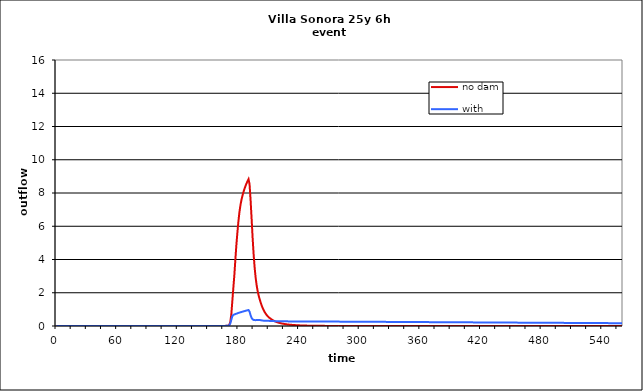
| Category | no dam | with dam |
|---|---|---|
| 0.0 | 0 | 0 |
| 1.0 | 0 | 0 |
| 2.0 | 0 | 0 |
| 3.0 | 0 | 0 |
| 4.0 | 0 | 0 |
| 5.0 | 0 | 0 |
| 6.0 | 0 | 0 |
| 7.0 | 0 | 0 |
| 8.0 | 0 | 0 |
| 9.0 | 0 | 0 |
| 10.0 | 0 | 0 |
| 11.0 | 0 | 0 |
| 12.0 | 0 | 0 |
| 13.0 | 0 | 0 |
| 14.0 | 0 | 0 |
| 15.0 | 0 | 0 |
| 16.0 | 0 | 0 |
| 17.0 | 0 | 0 |
| 18.0 | 0 | 0 |
| 19.0 | 0 | 0 |
| 20.0 | 0 | 0 |
| 21.0 | 0 | 0 |
| 22.0 | 0 | 0 |
| 23.0 | 0 | 0 |
| 24.0 | 0 | 0 |
| 25.0 | 0 | 0 |
| 26.0 | 0 | 0 |
| 27.0 | 0 | 0 |
| 28.0 | 0 | 0 |
| 29.0 | 0 | 0 |
| 30.0 | 0 | 0 |
| 31.0 | 0 | 0 |
| 32.0 | 0 | 0 |
| 33.0 | 0 | 0 |
| 34.0 | 0 | 0 |
| 35.0 | 0 | 0 |
| 36.0 | 0 | 0 |
| 37.0 | 0 | 0 |
| 38.0 | 0 | 0 |
| 39.0 | 0 | 0 |
| 40.0 | 0 | 0 |
| 41.0 | 0 | 0 |
| 42.0 | 0 | 0 |
| 43.0 | 0 | 0 |
| 44.0 | 0 | 0 |
| 45.0 | 0 | 0 |
| 46.0 | 0 | 0 |
| 47.0 | 0 | 0 |
| 48.0 | 0 | 0 |
| 49.0 | 0 | 0 |
| 50.0 | 0 | 0 |
| 51.0 | 0 | 0 |
| 52.0 | 0 | 0 |
| 53.0 | 0 | 0 |
| 54.0 | 0 | 0 |
| 55.0 | 0 | 0 |
| 56.0 | 0 | 0 |
| 57.0 | 0 | 0 |
| 58.0 | 0 | 0 |
| 59.0 | 0 | 0 |
| 60.0 | 0 | 0 |
| 61.0 | 0 | 0 |
| 62.0 | 0 | 0 |
| 63.0 | 0 | 0 |
| 64.0 | 0 | 0 |
| 65.0 | 0 | 0 |
| 66.0 | 0 | 0 |
| 67.0 | 0 | 0 |
| 68.0 | 0 | 0 |
| 69.0 | 0 | 0 |
| 70.0 | 0 | 0 |
| 71.0 | 0 | 0 |
| 72.0 | 0 | 0 |
| 73.0 | 0 | 0 |
| 74.0 | 0 | 0 |
| 75.0 | 0 | 0 |
| 76.0 | 0 | 0 |
| 77.0 | 0 | 0 |
| 78.0 | 0 | 0 |
| 79.0 | 0 | 0 |
| 80.0 | 0 | 0 |
| 81.0 | 0 | 0 |
| 82.0 | 0 | 0 |
| 83.0 | 0 | 0 |
| 84.0 | 0 | 0 |
| 85.0 | 0 | 0 |
| 86.0 | 0 | 0 |
| 87.0 | 0 | 0 |
| 88.0 | 0 | 0 |
| 89.0 | 0 | 0 |
| 90.0 | 0 | 0 |
| 91.0 | 0 | 0 |
| 92.0 | 0 | 0 |
| 93.0 | 0 | 0 |
| 94.0 | 0 | 0 |
| 95.0 | 0 | 0 |
| 96.0 | 0 | 0 |
| 97.0 | 0 | 0 |
| 98.0 | 0 | 0 |
| 99.0 | 0 | 0 |
| 100.0 | 0 | 0 |
| 101.0 | 0 | 0 |
| 102.0 | 0 | 0 |
| 103.0 | 0 | 0 |
| 104.0 | 0 | 0 |
| 105.0 | 0 | 0 |
| 106.0 | 0 | 0 |
| 107.0 | 0 | 0 |
| 108.0 | 0 | 0 |
| 109.0 | 0 | 0 |
| 110.0 | 0 | 0 |
| 111.0 | 0 | 0 |
| 112.0 | 0 | 0 |
| 113.0 | 0 | 0 |
| 114.0 | 0 | 0 |
| 115.0 | 0 | 0 |
| 116.0 | 0 | 0 |
| 117.0 | 0 | 0 |
| 118.0 | 0 | 0 |
| 119.0 | 0 | 0 |
| 120.0 | 0 | 0 |
| 121.0 | 0 | 0 |
| 122.0 | 0 | 0 |
| 123.0 | 0 | 0 |
| 124.0 | 0 | 0 |
| 125.0 | 0 | 0 |
| 126.0 | 0 | 0 |
| 127.0 | 0 | 0 |
| 128.0 | 0 | 0 |
| 129.0 | 0 | 0 |
| 130.0 | 0 | 0 |
| 131.0 | 0 | 0 |
| 132.0 | 0 | 0 |
| 133.0 | 0 | 0 |
| 134.0 | 0 | 0 |
| 135.0 | 0 | 0 |
| 136.0 | 0 | 0 |
| 137.0 | 0 | 0 |
| 138.0 | 0 | 0 |
| 139.0 | 0 | 0 |
| 140.0 | 0 | 0 |
| 141.0 | 0 | 0 |
| 142.0 | 0 | 0 |
| 143.0 | 0 | 0 |
| 144.0 | 0 | 0 |
| 145.0 | 0 | 0 |
| 146.0 | 0 | 0 |
| 147.0 | 0 | 0 |
| 148.0 | 0 | 0 |
| 149.0 | 0 | 0 |
| 150.0 | 0 | 0 |
| 151.0 | 0 | 0 |
| 152.0 | 0 | 0 |
| 153.0 | 0 | 0 |
| 154.0 | 0 | 0 |
| 155.0 | 0 | 0 |
| 156.0 | 0 | 0 |
| 157.0 | 0 | 0 |
| 158.0 | 0 | 0 |
| 159.0 | 0 | 0 |
| 160.0 | 0 | 0 |
| 161.0 | 0 | 0 |
| 162.0 | 0 | 0 |
| 163.0 | 0 | 0 |
| 164.0 | 0.001 | 0.001 |
| 165.0 | 0.002 | 0.002 |
| 166.0 | 0.003 | 0.004 |
| 167.0 | 0.007 | 0.007 |
| 168.0 | 0.011 | 0.011 |
| 169.0 | 0.016 | 0.016 |
| 170.0 | 0.021 | 0.021 |
| 171.0 | 0.078 | 0.05 |
| 172.0 | 0.256 | 0.164 |
| 173.0 | 0.726 | 0.386 |
| 174.0 | 1.527 | 0.597 |
| 175.0 | 2.314 | 0.669 |
| 176.0 | 3.094 | 0.697 |
| 177.0 | 4.027 | 0.718 |
| 178.0 | 4.903 | 0.739 |
| 179.0 | 5.638 | 0.763 |
| 180.0 | 6.303 | 0.786 |
| 181.0 | 6.851 | 0.806 |
| 182.0 | 7.267 | 0.825 |
| 183.0 | 7.584 | 0.843 |
| 184.0 | 7.842 | 0.861 |
| 185.0 | 8.06 | 0.879 |
| 186.0 | 8.254 | 0.897 |
| 187.0 | 8.424 | 0.914 |
| 188.0 | 8.575 | 0.931 |
| 189.0 | 8.709 | 0.946 |
| 190.0 | 8.83 | 0.961 |
| 191.0 | 8.529 | 0.863 |
| 192.0 | 7.603 | 0.653 |
| 193.0 | 6.498 | 0.49 |
| 194.0 | 5.346 | 0.405 |
| 195.0 | 4.343 | 0.367 |
| 196.0 | 3.541 | 0.354 |
| 197.0 | 2.923 | 0.353 |
| 198.0 | 2.457 | 0.356 |
| 199.0 | 2.105 | 0.359 |
| 200.0 | 1.834 | 0.362 |
| 201.0 | 1.613 | 0.361 |
| 202.0 | 1.414 | 0.351 |
| 203.0 | 1.236 | 0.338 |
| 204.0 | 1.082 | 0.327 |
| 205.0 | 0.951 | 0.32 |
| 206.0 | 0.837 | 0.314 |
| 207.0 | 0.739 | 0.311 |
| 208.0 | 0.655 | 0.309 |
| 209.0 | 0.584 | 0.308 |
| 210.0 | 0.525 | 0.309 |
| 211.0 | 0.475 | 0.308 |
| 212.0 | 0.43 | 0.305 |
| 213.0 | 0.389 | 0.3 |
| 214.0 | 0.35 | 0.297 |
| 215.0 | 0.316 | 0.294 |
| 216.0 | 0.286 | 0.291 |
| 217.0 | 0.259 | 0.289 |
| 218.0 | 0.235 | 0.288 |
| 219.0 | 0.214 | 0.286 |
| 220.0 | 0.195 | 0.286 |
| 221.0 | 0.178 | 0.285 |
| 222.0 | 0.164 | 0.283 |
| 223.0 | 0.15 | 0.282 |
| 224.0 | 0.138 | 0.281 |
| 225.0 | 0.127 | 0.28 |
| 226.0 | 0.116 | 0.28 |
| 227.0 | 0.107 | 0.279 |
| 228.0 | 0.099 | 0.279 |
| 229.0 | 0.091 | 0.278 |
| 230.0 | 0.084 | 0.278 |
| 231.0 | 0.078 | 0.278 |
| 232.0 | 0.072 | 0.277 |
| 233.0 | 0.067 | 0.277 |
| 234.0 | 0.062 | 0.277 |
| 235.0 | 0.058 | 0.276 |
| 236.0 | 0.054 | 0.276 |
| 237.0 | 0.05 | 0.276 |
| 238.0 | 0.046 | 0.276 |
| 239.0 | 0.043 | 0.275 |
| 240.0 | 0.04 | 0.275 |
| 241.0 | 0.037 | 0.275 |
| 242.0 | 0.034 | 0.275 |
| 243.0 | 0.031 | 0.274 |
| 244.0 | 0.029 | 0.274 |
| 245.0 | 0.027 | 0.274 |
| 246.0 | 0.025 | 0.274 |
| 247.0 | 0.024 | 0.273 |
| 248.0 | 0.022 | 0.273 |
| 249.0 | 0.021 | 0.273 |
| 250.0 | 0.019 | 0.272 |
| 251.0 | 0.018 | 0.272 |
| 252.0 | 0.017 | 0.272 |
| 253.0 | 0.016 | 0.272 |
| 254.0 | 0.015 | 0.271 |
| 255.0 | 0.014 | 0.271 |
| 256.0 | 0.013 | 0.271 |
| 257.0 | 0.012 | 0.27 |
| 258.0 | 0.011 | 0.27 |
| 259.0 | 0.011 | 0.27 |
| 260.0 | 0.01 | 0.269 |
| 261.0 | 0.01 | 0.269 |
| 262.0 | 0.009 | 0.269 |
| 263.0 | 0.009 | 0.269 |
| 264.0 | 0.008 | 0.268 |
| 265.0 | 0.008 | 0.268 |
| 266.0 | 0.007 | 0.268 |
| 267.0 | 0.007 | 0.267 |
| 268.0 | 0.006 | 0.267 |
| 269.0 | 0.006 | 0.267 |
| 270.0 | 0.006 | 0.266 |
| 271.0 | 0.005 | 0.266 |
| 272.0 | 0.005 | 0.266 |
| 273.0 | 0.005 | 0.265 |
| 274.0 | 0.004 | 0.265 |
| 275.0 | 0.004 | 0.265 |
| 276.0 | 0.004 | 0.264 |
| 277.0 | 0.003 | 0.264 |
| 278.0 | 0.003 | 0.264 |
| 279.0 | 0.003 | 0.263 |
| 280.0 | 0.003 | 0.263 |
| 281.0 | 0.002 | 0.263 |
| 282.0 | 0.002 | 0.263 |
| 283.0 | 0.002 | 0.262 |
| 284.0 | 0.002 | 0.262 |
| 285.0 | 0.002 | 0.262 |
| 286.0 | 0.001 | 0.261 |
| 287.0 | 0.001 | 0.261 |
| 288.0 | 0.001 | 0.261 |
| 289.0 | 0.001 | 0.26 |
| 290.0 | 0.001 | 0.26 |
| 291.0 | 0.001 | 0.26 |
| 292.0 | 0.001 | 0.259 |
| 293.0 | 0.001 | 0.259 |
| 294.0 | 0.001 | 0.259 |
| 295.0 | 0.001 | 0.258 |
| 296.0 | 0 | 0.258 |
| 297.0 | 0 | 0.258 |
| 298.0 | 0 | 0.257 |
| 299.0 | 0 | 0.257 |
| 300.0 | 0 | 0.257 |
| 301.0 | 0 | 0.256 |
| 302.0 | 0 | 0.256 |
| 303.0 | 0 | 0.256 |
| 304.0 | 0 | 0.255 |
| 305.0 | 0 | 0.255 |
| 306.0 | 0 | 0.255 |
| 307.0 | 0 | 0.254 |
| 308.0 | 0 | 0.254 |
| 309.0 | 0 | 0.254 |
| 310.0 | 0 | 0.253 |
| 311.0 | 0 | 0.253 |
| 312.0 | 0 | 0.253 |
| 313.0 | 0 | 0.252 |
| 314.0 | 0 | 0.252 |
| 315.0 | 0 | 0.252 |
| 316.0 | 0 | 0.251 |
| 317.0 | 0 | 0.251 |
| 318.0 | 0 | 0.251 |
| 319.0 | 0 | 0.25 |
| 320.0 | 0 | 0.25 |
| 321.0 | 0 | 0.25 |
| 322.0 | 0 | 0.249 |
| 323.0 | 0 | 0.249 |
| 324.0 | 0 | 0.249 |
| 325.0 | 0 | 0.248 |
| 326.0 | 0 | 0.248 |
| 327.0 | 0 | 0.248 |
| 328.0 | 0 | 0.247 |
| 329.0 | 0 | 0.247 |
| 330.0 | 0 | 0.247 |
| 331.0 | 0 | 0.246 |
| 332.0 | 0 | 0.246 |
| 333.0 | 0 | 0.245 |
| 334.0 | 0 | 0.245 |
| 335.0 | 0 | 0.245 |
| 336.0 | 0 | 0.244 |
| 337.0 | 0 | 0.244 |
| 338.0 | 0 | 0.244 |
| 339.0 | 0 | 0.243 |
| 340.0 | 0 | 0.243 |
| 341.0 | 0 | 0.243 |
| 342.0 | 0 | 0.242 |
| 343.0 | 0 | 0.242 |
| 344.0 | 0 | 0.242 |
| 345.0 | 0 | 0.241 |
| 346.0 | 0 | 0.241 |
| 347.0 | 0 | 0.241 |
| 348.0 | 0 | 0.24 |
| 349.0 | 0 | 0.24 |
| 350.0 | 0 | 0.239 |
| 351.0 | 0 | 0.239 |
| 352.0 | 0 | 0.239 |
| 353.0 | 0 | 0.238 |
| 354.0 | 0 | 0.238 |
| 355.0 | 0 | 0.238 |
| 356.0 | 0 | 0.237 |
| 357.0 | 0 | 0.237 |
| 358.0 | 0 | 0.237 |
| 359.0 | 0 | 0.236 |
| 360.0 | 0 | 0.236 |
| 361.0 | 0 | 0.236 |
| 362.0 | 0 | 0.235 |
| 363.0 | 0 | 0.235 |
| 364.0 | 0 | 0.235 |
| 365.0 | 0 | 0.234 |
| 366.0 | 0 | 0.234 |
| 367.0 | 0 | 0.233 |
| 368.0 | 0 | 0.233 |
| 369.0 | 0 | 0.233 |
| 370.0 | 0 | 0.232 |
| 371.0 | 0 | 0.232 |
| 372.0 | 0 | 0.232 |
| 373.0 | 0 | 0.231 |
| 374.0 | 0 | 0.231 |
| 375.0 | 0 | 0.231 |
| 376.0 | 0 | 0.23 |
| 377.0 | 0 | 0.23 |
| 378.0 | 0 | 0.23 |
| 379.0 | 0 | 0.229 |
| 380.0 | 0 | 0.229 |
| 381.0 | 0 | 0.229 |
| 382.0 | 0 | 0.228 |
| 383.0 | 0 | 0.228 |
| 384.0 | 0 | 0.228 |
| 385.0 | 0 | 0.227 |
| 386.0 | 0 | 0.227 |
| 387.0 | 0 | 0.226 |
| 388.0 | 0 | 0.226 |
| 389.0 | 0 | 0.226 |
| 390.0 | 0 | 0.225 |
| 391.0 | 0 | 0.225 |
| 392.0 | 0 | 0.225 |
| 393.0 | 0 | 0.224 |
| 394.0 | 0 | 0.224 |
| 395.0 | 0 | 0.224 |
| 396.0 | 0 | 0.223 |
| 397.0 | 0 | 0.223 |
| 398.0 | 0 | 0.223 |
| 399.0 | 0 | 0.222 |
| 400.0 | 0 | 0.222 |
| 401.0 | 0 | 0.222 |
| 402.0 | 0 | 0.221 |
| 403.0 | 0 | 0.221 |
| 404.0 | 0 | 0.221 |
| 405.0 | 0 | 0.22 |
| 406.0 | 0 | 0.22 |
| 407.0 | 0 | 0.22 |
| 408.0 | 0 | 0.219 |
| 409.0 | 0 | 0.219 |
| 410.0 | 0 | 0.219 |
| 411.0 | 0 | 0.218 |
| 412.0 | 0 | 0.218 |
| 413.0 | 0 | 0.218 |
| 414.0 | 0 | 0.217 |
| 415.0 | 0 | 0.217 |
| 416.0 | 0 | 0.216 |
| 417.0 | 0 | 0.216 |
| 418.0 | 0 | 0.216 |
| 419.0 | 0 | 0.215 |
| 420.0 | 0 | 0.215 |
| 421.0 | 0 | 0.215 |
| 422.0 | 0 | 0.214 |
| 423.0 | 0 | 0.214 |
| 424.0 | 0 | 0.214 |
| 425.0 | 0 | 0.213 |
| 426.0 | 0 | 0.213 |
| 427.0 | 0 | 0.213 |
| 428.0 | 0 | 0.212 |
| 429.0 | 0 | 0.212 |
| 430.0 | 0 | 0.212 |
| 431.0 | 0 | 0.211 |
| 432.0 | 0 | 0.211 |
| 433.0 | 0 | 0.211 |
| 434.0 | 0 | 0.21 |
| 435.0 | 0 | 0.21 |
| 436.0 | 0 | 0.21 |
| 437.0 | 0 | 0.209 |
| 438.0 | 0 | 0.209 |
| 439.0 | 0 | 0.209 |
| 440.0 | 0 | 0.208 |
| 441.0 | 0 | 0.208 |
| 442.0 | 0 | 0.208 |
| 443.0 | 0 | 0.207 |
| 444.0 | 0 | 0.207 |
| 445.0 | 0 | 0.207 |
| 446.0 | 0 | 0.206 |
| 447.0 | 0 | 0.206 |
| 448.0 | 0 | 0.206 |
| 449.0 | 0 | 0.205 |
| 450.0 | 0 | 0.205 |
| 451.0 | 0 | 0.205 |
| 452.0 | 0 | 0.204 |
| 453.0 | 0 | 0.204 |
| 454.0 | 0 | 0.204 |
| 455.0 | 0 | 0.203 |
| 456.0 | 0 | 0.203 |
| 457.0 | 0 | 0.203 |
| 458.0 | 0 | 0.202 |
| 459.0 | 0 | 0.202 |
| 460.0 | 0 | 0.202 |
| 461.0 | 0 | 0.201 |
| 462.0 | 0 | 0.201 |
| 463.0 | 0 | 0.201 |
| 464.0 | 0 | 0.2 |
| 465.0 | 0 | 0.2 |
| 466.0 | 0 | 0.2 |
| 467.0 | 0 | 0.199 |
| 468.0 | 0 | 0.199 |
| 469.0 | 0 | 0.199 |
| 470.0 | 0 | 0.198 |
| 471.0 | 0 | 0.198 |
| 472.0 | 0 | 0.198 |
| 473.0 | 0 | 0.197 |
| 474.0 | 0 | 0.197 |
| 475.0 | 0 | 0.197 |
| 476.0 | 0 | 0.196 |
| 477.0 | 0 | 0.196 |
| 478.0 | 0 | 0.196 |
| 479.0 | 0 | 0.195 |
| 480.0 | 0 | 0.195 |
| 481.0 | 0 | 0.195 |
| 482.0 | 0 | 0.194 |
| 483.0 | 0 | 0.194 |
| 484.0 | 0 | 0.194 |
| 485.0 | 0 | 0.193 |
| 486.0 | 0 | 0.193 |
| 487.0 | 0 | 0.193 |
| 488.0 | 0 | 0.192 |
| 489.0 | 0 | 0.192 |
| 490.0 | 0 | 0.192 |
| 491.0 | 0 | 0.191 |
| 492.0 | 0 | 0.191 |
| 493.0 | 0 | 0.191 |
| 494.0 | 0 | 0.19 |
| 495.0 | 0 | 0.19 |
| 496.0 | 0 | 0.19 |
| 497.0 | 0 | 0.189 |
| 498.0 | 0 | 0.189 |
| 499.0 | 0 | 0.189 |
| 500.0 | 0 | 0.188 |
| 501.0 | 0 | 0.188 |
| 502.0 | 0 | 0.188 |
| 503.0 | 0 | 0.187 |
| 504.0 | 0 | 0.187 |
| 505.0 | 0 | 0.187 |
| 506.0 | 0 | 0.186 |
| 507.0 | 0 | 0.186 |
| 508.0 | 0 | 0.186 |
| 509.0 | 0 | 0.185 |
| 510.0 | 0 | 0.185 |
| 511.0 | 0 | 0.185 |
| 512.0 | 0 | 0.185 |
| 513.0 | 0 | 0.184 |
| 514.0 | 0 | 0.184 |
| 515.0 | 0 | 0.184 |
| 516.0 | 0 | 0.183 |
| 517.0 | 0 | 0.183 |
| 518.0 | 0 | 0.183 |
| 519.0 | 0 | 0.182 |
| 520.0 | 0 | 0.182 |
| 521.0 | 0 | 0.182 |
| 522.0 | 0 | 0.181 |
| 523.0 | 0 | 0.181 |
| 524.0 | 0 | 0.18 |
| 525.0 | 0 | 0.18 |
| 526.0 | 0 | 0.18 |
| 527.0 | 0 | 0.179 |
| 528.0 | 0 | 0.179 |
| 529.0 | 0 | 0.179 |
| 530.0 | 0 | 0.178 |
| 531.0 | 0 | 0.178 |
| 532.0 | 0 | 0.178 |
| 533.0 | 0 | 0.177 |
| 534.0 | 0 | 0.177 |
| 535.0 | 0 | 0.177 |
| 536.0 | 0 | 0.176 |
| 537.0 | 0 | 0.176 |
| 538.0 | 0 | 0.176 |
| 539.0 | 0 | 0.175 |
| 540.0 | 0 | 0.175 |
| 541.0 | 0 | 0.175 |
| 542.0 | 0 | 0.174 |
| 543.0 | 0 | 0.174 |
| 544.0 | 0 | 0.174 |
| 545.0 | 0 | 0.173 |
| 546.0 | 0 | 0.173 |
| 547.0 | 0 | 0.172 |
| 548.0 | 0 | 0.172 |
| 549.0 | 0 | 0.172 |
| 550.0 | 0 | 0.171 |
| 551.0 | 0 | 0.171 |
| 552.0 | 0 | 0.171 |
| 553.0 | 0 | 0.17 |
| 554.0 | 0 | 0.17 |
| 555.0 | 0 | 0.17 |
| 556.0 | 0 | 0.169 |
| 557.0 | 0 | 0.169 |
| 558.0 | 0 | 0.169 |
| 559.0 | 0 | 0.168 |
| 560.0 | 0 | 0.168 |